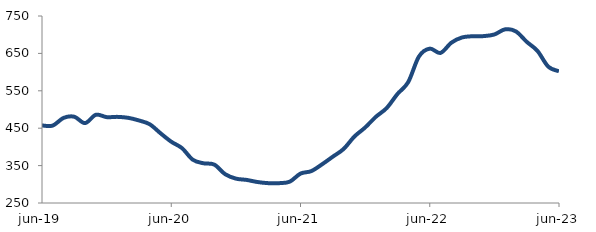
| Category | Series 0 |
|---|---|
| 2019-06-01 | 457.312 |
| 2019-07-01 | 457.058 |
| 2019-08-01 | 477.544 |
| 2019-09-01 | 480.652 |
| 2019-10-01 | 463.67 |
| 2019-11-01 | 485.887 |
| 2019-12-01 | 479.593 |
| 2020-01-01 | 480.293 |
| 2020-02-01 | 477.774 |
| 2020-03-01 | 470.708 |
| 2020-04-01 | 460.537 |
| 2020-05-01 | 436.562 |
| 2020-06-01 | 413.857 |
| 2020-07-01 | 396.652 |
| 2020-08-01 | 365.687 |
| 2020-09-01 | 356.18 |
| 2020-10-01 | 352.658 |
| 2020-11-01 | 327.164 |
| 2020-12-01 | 315.173 |
| 2021-01-01 | 311.708 |
| 2021-02-01 | 306.103 |
| 2021-03-01 | 303.075 |
| 2021-04-01 | 303.034 |
| 2021-05-01 | 306.996 |
| 2021-06-01 | 328.614 |
| 2021-07-01 | 335.232 |
| 2021-08-01 | 353.414 |
| 2021-09-01 | 373.869 |
| 2021-10-01 | 394.393 |
| 2021-11-01 | 427.592 |
| 2021-12-01 | 451.83 |
| 2022-01-01 | 480.528 |
| 2022-02-01 | 503.882 |
| 2022-03-01 | 541.428 |
| 2022-04-01 | 573.261 |
| 2022-05-01 | 641.774 |
| 2022-06-01 | 662.728 |
| 2022-07-01 | 651.267 |
| 2022-08-01 | 678.506 |
| 2022-09-01 | 692.688 |
| 2022-10-01 | 695.873 |
| 2022-11-01 | 696.235 |
| 2022-12-01 | 700.598 |
| 2023-01-01 | 714.422 |
| 2023-02-01 | 708.75 |
| 2023-03-01 | 680.994 |
| 2023-04-01 | 656.708 |
| 2023-05-01 | 614.698 |
| 2023-06-01 | 602.139 |